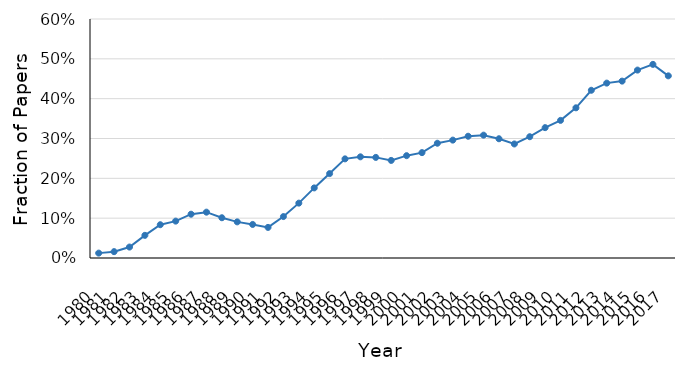
| Category | Identification |
|---|---|
| 1980.0 | 0.012 |
| 1981.0 | 0.016 |
| 1982.0 | 0.027 |
| 1983.0 | 0.057 |
| 1984.0 | 0.084 |
| 1985.0 | 0.093 |
| 1986.0 | 0.11 |
| 1987.0 | 0.115 |
| 1988.0 | 0.101 |
| 1989.0 | 0.091 |
| 1990.0 | 0.084 |
| 1991.0 | 0.077 |
| 1992.0 | 0.104 |
| 1993.0 | 0.138 |
| 1994.0 | 0.176 |
| 1995.0 | 0.212 |
| 1996.0 | 0.249 |
| 1997.0 | 0.254 |
| 1998.0 | 0.253 |
| 1999.0 | 0.245 |
| 2000.0 | 0.257 |
| 2001.0 | 0.265 |
| 2002.0 | 0.288 |
| 2003.0 | 0.296 |
| 2004.0 | 0.306 |
| 2005.0 | 0.308 |
| 2006.0 | 0.299 |
| 2007.0 | 0.286 |
| 2008.0 | 0.304 |
| 2009.0 | 0.327 |
| 2010.0 | 0.345 |
| 2011.0 | 0.377 |
| 2012.0 | 0.421 |
| 2013.0 | 0.439 |
| 2014.0 | 0.444 |
| 2015.0 | 0.472 |
| 2016.0 | 0.486 |
| 2017.0 | 0.457 |